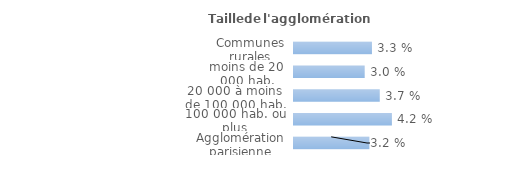
| Category | Series 0 |
|---|---|
| Communes rurales | 0.033 |
| moins de 20 000 hab. | 0.03 |
| 20 000 à moins de 100 000 hab. | 0.037 |
| 100 000 hab. ou plus | 0.042 |
| Agglomération parisienne | 0.032 |